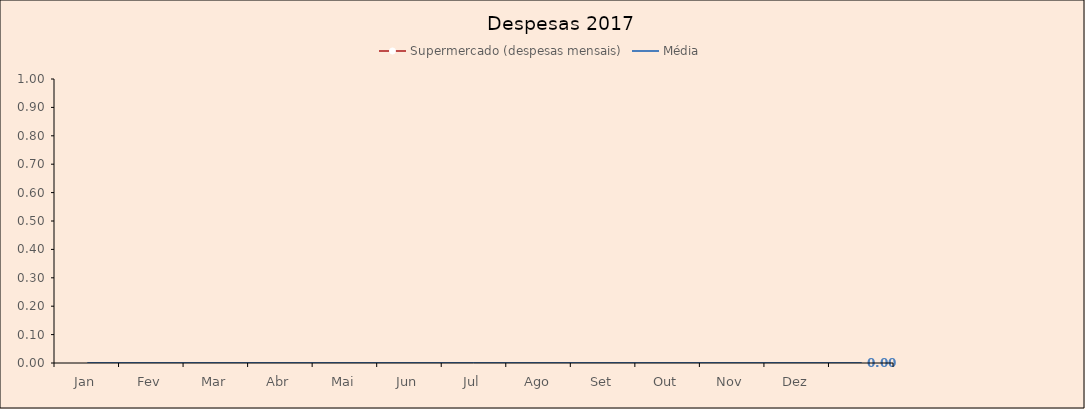
| Category | Supermercado (despesas mensais) | Média |
|---|---|---|
| Jan |  | 0 |
| Fev |  | 0 |
| Mar |  | 0 |
| Abr |  | 0 |
| Mai |  | 0 |
| Jun |  | 0 |
| Jul |  | 0 |
| Ago |  | 0 |
| Set |  | 0 |
| Out |  | 0 |
| Nov |  | 0 |
| Dez |  | 0 |